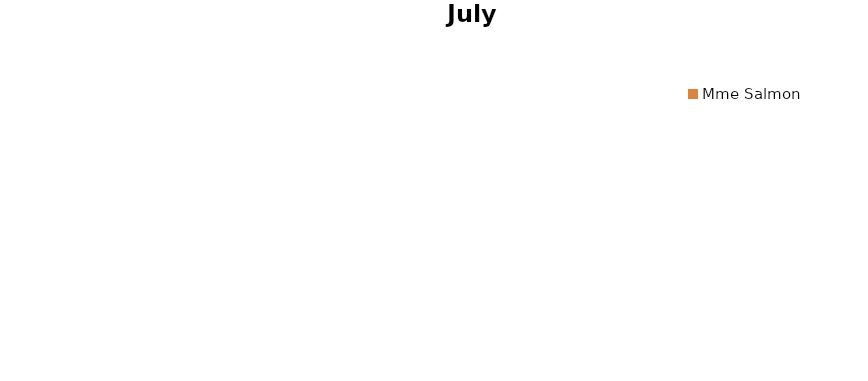
| Category | juillet 2013 |
|---|---|
| Mme D'Harcourt | 0 |
| Mme Bertrand | 0 |
| Mlle Vanthomme | 0 |
| Mme Tercinier | 0 |
| Mme De Vilelle | 0 |
| Mme Salmon | 0 |